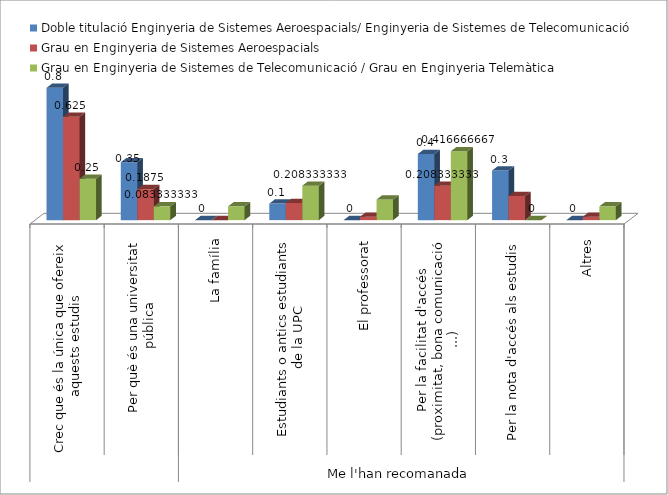
| Category | Doble titulació Enginyeria de Sistemes Aeroespacials/ Enginyeria de Sistemes de Telecomunicació | Grau en Enginyeria de Sistemes Aeroespacials 
 | Grau en Enginyeria de Sistemes de Telecomunicació / Grau en Enginyeria Telemàtica |
|---|---|---|---|
| 0 | 0.8 | 0.625 | 0.25 |
| 1 | 0.35 | 0.188 | 0.083 |
| 2 | 0 | 0 | 0.083 |
| 3 | 0.1 | 0.104 | 0.208 |
| 4 | 0 | 0.021 | 0.125 |
| 5 | 0.4 | 0.208 | 0.417 |
| 6 | 0.3 | 0.146 | 0 |
| 7 | 0 | 0.021 | 0.083 |